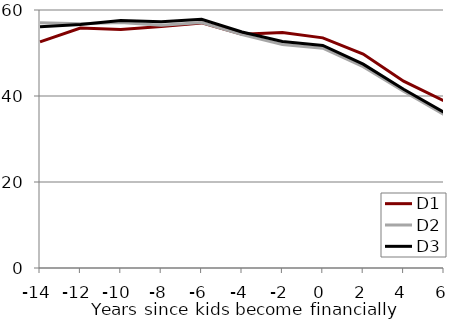
| Category | D1 | D2 | D3 |
|---|---|---|---|
| -14.0 | 52.599 | 57.023 | 56.102 |
| -12.0 | 55.818 | 56.829 | 56.612 |
| -10.0 | 55.447 | 57.086 | 57.547 |
| -8.0 | 56.175 | 56.47 | 57.263 |
| -6.0 | 56.995 | 57.103 | 57.856 |
| -4.0 | 54.373 | 54.274 | 54.894 |
| -2.0 | 54.761 | 51.978 | 52.664 |
| 0.0 | 53.515 | 51.105 | 51.759 |
| 2.0 | 49.76 | 46.814 | 47.412 |
| 4.0 | 43.458 | 41.099 | 41.554 |
| 6.0 | 38.888 | 35.653 | 36.215 |